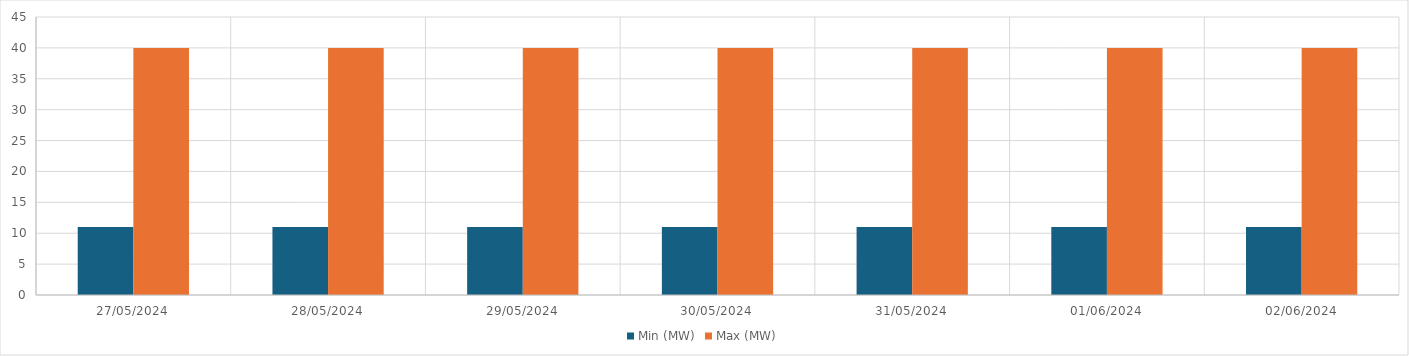
| Category | Min (MW) | Max (MW) |
|---|---|---|
| 27/05/2024 | 11 | 40 |
| 28/05/2024 | 11 | 40 |
| 29/05/2024 | 11 | 40 |
| 30/05/2024 | 11 | 40 |
| 31/05/2024 | 11 | 40 |
| 01/06/2024 | 11 | 40 |
| 02/06/2024 | 11 | 40 |